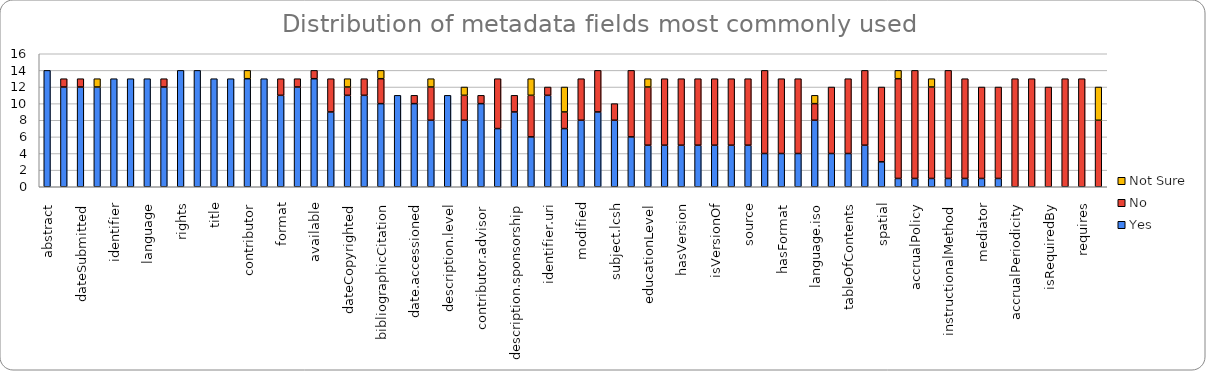
| Category | Yes | No | Not Sure |
|---|---|---|---|
| abstract | 14 | 0 | 0 |
| creator | 12 | 1 | 0 |
| dateSubmitted | 12 | 1 | 0 |
| description | 12 | 0 | 1 |
| identifier | 13 | 0 | 0 |
| issued | 13 | 0 | 0 |
| language | 13 | 0 | 0 |
| medium | 12 | 1 | 0 |
| rights | 14 | 0 | 0 |
| subject | 14 | 0 | 0 |
| title | 13 | 0 | 0 |
| type | 13 | 0 | 0 |
| contributor | 13 | 0 | 1 |
| created | 13 | 0 | 0 |
| format | 11 | 2 | 0 |
| publisher | 12 | 1 | 0 |
| available | 13 | 1 | 0 |
| date | 9 | 4 | 0 |
| dateCopyrighted | 11 | 1 | 1 |
| Acknowledgement / Sponsor | 11 | 2 | 0 |
| bibliographicCitation | 10 | 3 | 1 |
| contributor.author | 11 | 0 | 0 |
| date.accessioned | 10 | 1 | 0 |
| dateAccepted | 8 | 4 | 1 |
| description.level | 11 | 0 | 0 |
| provenance | 8 | 3 | 1 |
| contributor.advisor | 10 | 1 | 0 |
| coverage | 7 | 6 | 0 |
| description.sponsorship | 9 | 2 | 0 |
| extent | 6 | 5 | 2 |
| identifier.uri | 11 | 1 | 0 |
| license | 7 | 2 | 3 |
| modified | 8 | 5 | 0 |
| rightsHolder | 9 | 5 | 0 |
| subject.lcsh | 8 | 2 | 0 |
| conformsTo | 6 | 8 | 0 |
| educationLevel | 5 | 7 | 1 |
| hasPart | 5 | 8 | 0 |
| hasVersion | 5 | 8 | 0 |
| isPartOf | 5 | 8 | 0 |
| isVersionOf | 5 | 8 | 0 |
| relation | 5 | 8 | 0 |
| source | 5 | 8 | 0 |
| alternative | 4 | 10 | 0 |
| hasFormat | 4 | 9 | 0 |
| isFormatOf | 4 | 9 | 0 |
| language.iso | 8 | 2 | 1 |
| references | 4 | 8 | 0 |
| tableOfContents | 4 | 9 | 0 |
| accessRights | 5 | 9 | 0 |
| spatial | 3 | 9 | 0 |
| accrualMethod | 1 | 12 | 1 |
| accrualPolicy | 1 | 13 | 0 |
| audience | 1 | 11 | 1 |
| instructionalMethod | 1 | 13 | 0 |
| isReferencedBy | 1 | 12 | 0 |
| mediator | 1 | 11 | 0 |
| temporal | 1 | 11 | 0 |
| accrualPeriodicity | 0 | 13 | 0 |
| isReplacedBy | 0 | 13 | 0 |
| isRequiredBy | 0 | 12 | 0 |
| replaces | 0 | 13 | 0 |
| requires | 0 | 13 | 0 |
| valid | 0 | 8 | 4 |